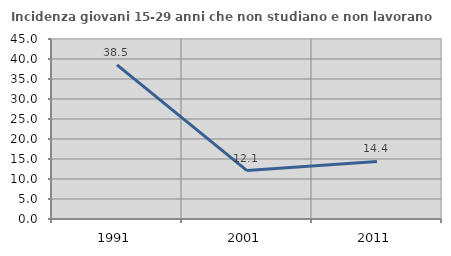
| Category | Incidenza giovani 15-29 anni che non studiano e non lavorano  |
|---|---|
| 1991.0 | 38.537 |
| 2001.0 | 12.102 |
| 2011.0 | 14.405 |